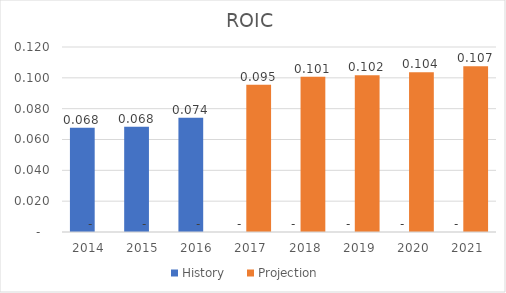
| Category | History | Projection |
|---|---|---|
| 2014.0 | 0.068 | 0 |
| 2015.0 | 0.068 | 0 |
| 2016.0 | 0.074 | 0 |
| 2017.0 | 0 | 0.095 |
| 2018.0 | 0 | 0.101 |
| 2019.0 | 0 | 0.102 |
| 2020.0 | 0 | 0.104 |
| 2021.0 | 0 | 0.107 |